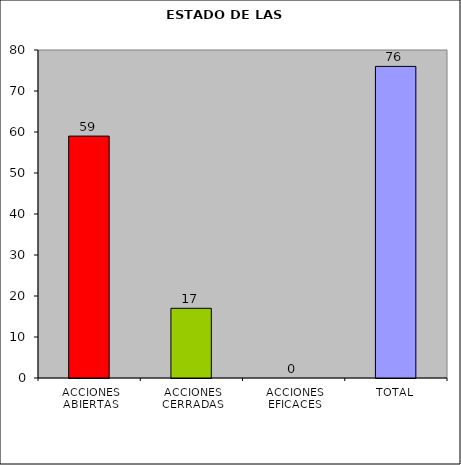
| Category | Series 0 |
|---|---|
| ACCIONES ABIERTAS | 59 |
| ACCIONES CERRADAS | 17 |
| ACCIONES EFICACES | 0 |
| TOTAL | 76 |